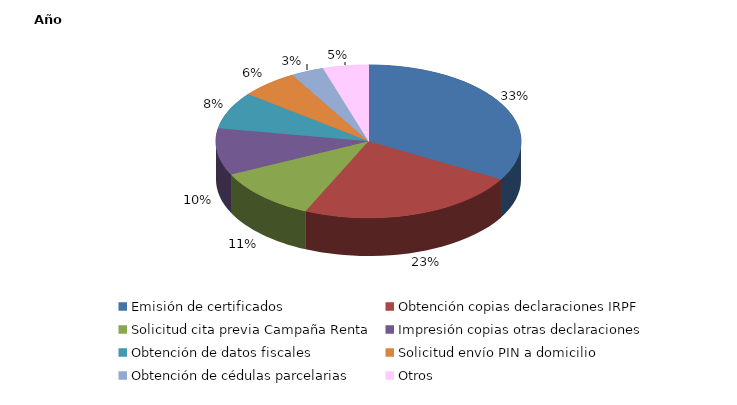
| Category | Series 0 |
|---|---|
| Emisión de certificados   | 1361 |
| Obtención copias declaraciones IRPF | 959 |
| Solicitud cita previa Campaña Renta | 453 |
| Impresión copias otras declaraciones | 406 |
| Obtención de datos fiscales | 319 |
| Solicitud envío PIN a domicilio | 250 |
| Obtención de cédulas parcelarias | 143 |
| Otros | 197 |